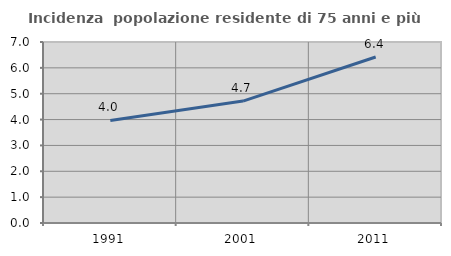
| Category | Incidenza  popolazione residente di 75 anni e più |
|---|---|
| 1991.0 | 3.965 |
| 2001.0 | 4.716 |
| 2011.0 | 6.421 |